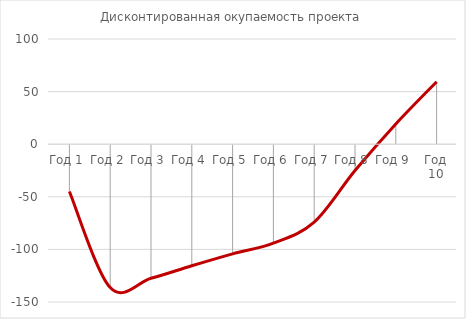
| Category | Дисконтированная окупаемость проекта |
|---|---|
| Год 1 | -44.995 |
| Год 2 | -136.291 |
| Год 3 | -127.465 |
| Год 4 | -115.53 |
| Год 5 | -104.217 |
| Год 6 | -94.068 |
| Год 7 | -74.153 |
| Год 8 | -25.069 |
| Год 9 | 19.304 |
| Год 10 | 59.419 |